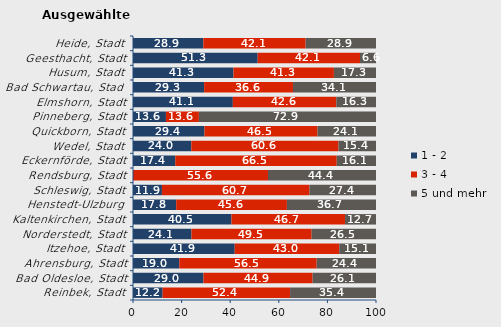
| Category | 1 - 2 | 3 - 4 | 5 und mehr |
|---|---|---|---|
| Reinbek, Stadt | 12.195 | 52.439 | 35.366 |
| Bad Oldesloe, Stadt | 28.986 | 44.928 | 26.087 |
| Ahrensburg, Stadt | 19.048 | 56.548 | 24.405 |
| Itzehoe, Stadt | 41.86 | 43.023 | 15.116 |
| Norderstedt, Stadt | 24.054 | 49.459 | 26.486 |
| Kaltenkirchen, Stadt | 40.523 | 46.732 | 12.745 |
| Henstedt-Ulzburg | 17.778 | 45.556 | 36.667 |
| Schleswig, Stadt | 11.905 | 60.714 | 27.381 |
| Rendsburg, Stadt | 0 | 55.556 | 44.444 |
| Eckernförde, Stadt | 17.391 | 66.46 | 16.149 |
| Wedel, Stadt | 24 | 60.571 | 15.429 |
| Quickborn, Stadt | 29.412 | 46.524 | 24.064 |
| Pinneberg, Stadt | 13.559 | 13.559 | 72.881 |
| Elmshorn, Stadt | 41.089 | 42.574 | 16.337 |
| Bad Schwartau, Stadt | 29.268 | 36.585 | 34.146 |
| Husum, Stadt | 41.339 | 41.339 | 17.323 |
| Geesthacht, Stadt | 51.316 | 42.105 | 6.579 |
| Heide, Stadt | 28.947 | 42.105 | 28.947 |